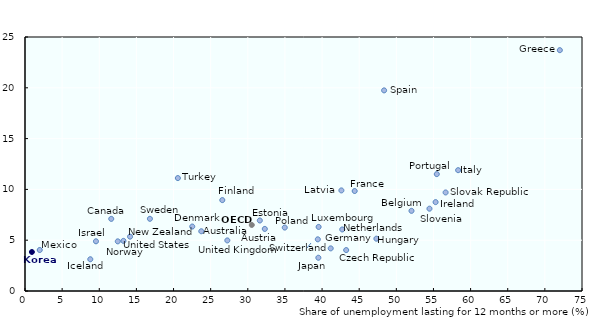
| Category | Series 0 |
|---|---|
| 23.7371616120749 | 5.88 |
| 32.2886809062047 | 6.111 |
| 52.0417669521684 | 7.888 |
| 11.6143841680828 | 7.1 |
| 43.2464528302013 | 4.027 |
| 22.5219136852042 | 6.345 |
| 31.6184648577805 | 6.939 |
| 26.5670310387479 | 8.946 |
| 44.3914681587735 | 9.841 |
| 41.1635007862783 | 4.196 |
| 72.015260249202 | 23.704 |
| 47.315898228303 | 5.148 |
| 8.79228942284529 | 3.124 |
| 55.2880968635234 | 8.749 |
| 9.55550061777302 | 4.891 |
| 58.3216443475957 | 11.892 |
| 39.5 | 3.274 |
| 0.928578486174133 | 3.839 |
| 42.6014696261719 | 9.901 |
| 39.5353934305541 | 6.307 |
| 1.98565957990445 | 4.036 |
| 42.7183683726671 | 6.057 |
| 14.1455437116897 | 5.349 |
| 12.4932798961618 | 4.887 |
| 34.9759021083158 | 6.244 |
| 55.4467514695316 | 11.504 |
| 56.6364527647326 | 9.699 |
| 54.460972263957 | 8.102 |
| 48.3528748116241 | 19.746 |
| 16.8199090956146 | 7.106 |
| 39.4266860458671 | 5.086 |
| 20.5829326923077 | 11.115 |
| 27.2444860337412 | 4.979 |
| 13.2544616001604 | 4.934 |
| 30.5378171645034 | 6.5 |